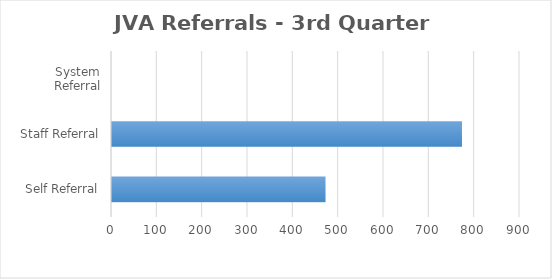
| Category | Series 0 |
|---|---|
| Self Referral | 471 |
| Staff Referral | 772 |
| System Referral | 0 |